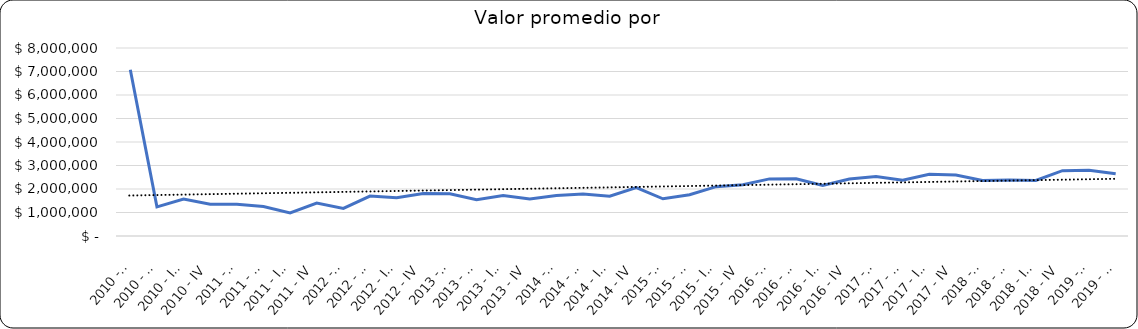
| Category | Valor m2 en Bogotá por sectores |
|---|---|
| 2010 - I | 7074425.287 |
| 2010 - II | 1241379.31 |
| 2010 - III | 1574712.644 |
| 2010 - IV | 1350574.713 |
| 2011 - I | 1353801.17 |
| 2011 - II | 1257309.942 |
| 2011 - III | 979532.164 |
| 2011 - IV | 1402923.977 |
| 2012 - I | 1172316.384 |
| 2012 - II | 1697740.113 |
| 2012 - III | 1627118.644 |
| 2012 - IV | 1807909.605 |
| 2013 - I | 1795977.011 |
| 2013 - II | 1545114.943 |
| 2013 - III | 1724137.931 |
| 2013 - IV | 1578060.345 |
| 2014 - I | 1724137.931 |
| 2014 - II | 1784482.759 |
| 2014 - III | 1695402.299 |
| 2014 - IV | 2063218.391 |
| 2015 - I | 1581920.904 |
| 2015 - II | 1757062.147 |
| 2015 - III | 2099200.565 |
| 2015 - IV | 2177966.102 |
| 2016 - I | 2430303.03 |
| 2016 - II | 2432098.765 |
| 2016 - III | 2148416.667 |
| 2016 - IV | 2424528.302 |
| 2017 - I | 2530864.198 |
| 2017 - II | 2377483.444 |
| 2017 - III | 2626543.21 |
| 2017 - IV | 2592592.593 |
| 2018 - I | 2363636.364 |
| 2018 - II | 2386792.453 |
| 2018 - III | 2363636 |
| 2018 - IV | 2780952 |
| 2019 - I | 2800000 |
| 2019 - II | 2647059 |